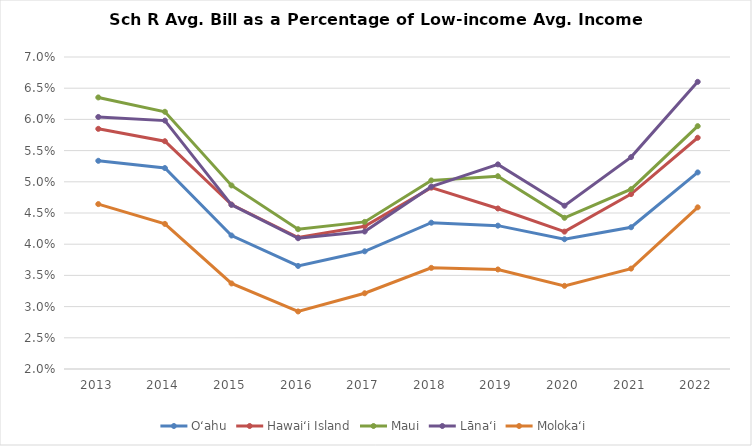
| Category | Oʻahu | Hawaiʻi Island | Maui | Lānaʻi | Molokaʻi |
|---|---|---|---|---|---|
| 2013.0 | 0.053 | 0.058 | 0.064 | 0.06 | 0.046 |
| 2014.0 | 0.052 | 0.057 | 0.061 | 0.06 | 0.043 |
| 2015.0 | 0.041 | 0.046 | 0.049 | 0.046 | 0.034 |
| 2016.0 | 0.037 | 0.041 | 0.042 | 0.041 | 0.029 |
| 2017.0 | 0.039 | 0.043 | 0.044 | 0.042 | 0.032 |
| 2018.0 | 0.043 | 0.049 | 0.05 | 0.049 | 0.036 |
| 2019.0 | 0.043 | 0.046 | 0.051 | 0.053 | 0.036 |
| 2020.0 | 0.041 | 0.042 | 0.044 | 0.046 | 0.033 |
| 2021.0 | 0.043 | 0.048 | 0.049 | 0.054 | 0.036 |
| 2022.0 | 0.052 | 0.057 | 0.059 | 0.066 | 0.046 |